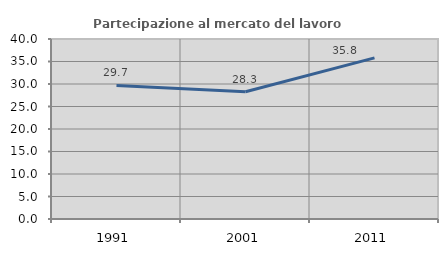
| Category | Partecipazione al mercato del lavoro  femminile |
|---|---|
| 1991.0 | 29.693 |
| 2001.0 | 28.285 |
| 2011.0 | 35.8 |